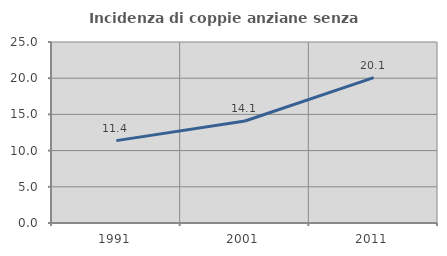
| Category | Incidenza di coppie anziane senza figli  |
|---|---|
| 1991.0 | 11.38 |
| 2001.0 | 14.088 |
| 2011.0 | 20.089 |